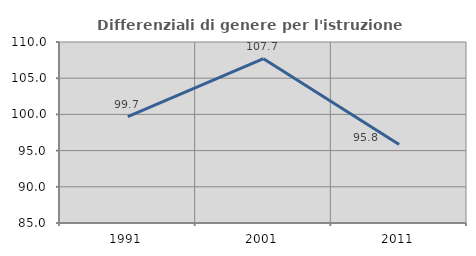
| Category | Differenziali di genere per l'istruzione superiore |
|---|---|
| 1991.0 | 99.709 |
| 2001.0 | 107.692 |
| 2011.0 | 95.839 |